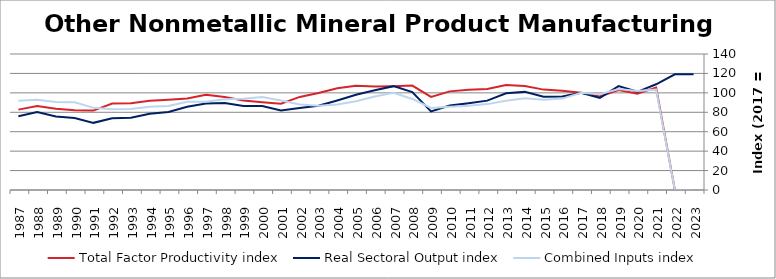
| Category | Total Factor Productivity index | Real Sectoral Output index | Combined Inputs index |
|---|---|---|---|
| 2023.0 | 0 | 119.182 | 0 |
| 2022.0 | 0 | 119.079 | 0 |
| 2021.0 | 105.375 | 108.817 | 103.266 |
| 2020.0 | 99.237 | 101.078 | 101.855 |
| 2019.0 | 102.915 | 106.972 | 103.942 |
| 2018.0 | 96.31 | 94.824 | 98.457 |
| 2017.0 | 100 | 100 | 100 |
| 2016.0 | 102.189 | 96.149 | 94.089 |
| 2015.0 | 103.333 | 96.027 | 92.93 |
| 2014.0 | 106.995 | 101.005 | 94.401 |
| 2013.0 | 108.167 | 99.487 | 91.975 |
| 2012.0 | 104.058 | 91.993 | 88.405 |
| 2011.0 | 103.124 | 89.358 | 86.651 |
| 2010.0 | 101.533 | 86.948 | 85.635 |
| 2009.0 | 95.819 | 80.946 | 84.478 |
| 2008.0 | 107.548 | 100.812 | 93.737 |
| 2007.0 | 106.89 | 106.904 | 100.014 |
| 2006.0 | 106.641 | 102.6 | 96.21 |
| 2005.0 | 107.225 | 98.001 | 91.398 |
| 2004.0 | 104.702 | 92.139 | 88.001 |
| 2003.0 | 99.91 | 86.665 | 86.743 |
| 2002.0 | 95.841 | 84.402 | 88.064 |
| 2001.0 | 88.8 | 81.772 | 92.086 |
| 2000.0 | 90.369 | 86.451 | 95.665 |
| 1999.0 | 92.173 | 86.487 | 93.832 |
| 1998.0 | 95.764 | 89.557 | 93.518 |
| 1997.0 | 97.94 | 89.049 | 90.922 |
| 1996.0 | 94.294 | 85.735 | 90.923 |
| 1995.0 | 93.017 | 80.343 | 86.374 |
| 1994.0 | 91.776 | 78.537 | 85.575 |
| 1993.0 | 89.286 | 74.425 | 83.356 |
| 1992.0 | 89.033 | 73.951 | 83.06 |
| 1991.0 | 81.749 | 69.131 | 84.564 |
| 1990.0 | 82.139 | 74.156 | 90.282 |
| 1989.0 | 83.727 | 75.757 | 90.481 |
| 1988.0 | 86.579 | 80.374 | 92.834 |
| 1987.0 | 82.735 | 75.956 | 91.807 |